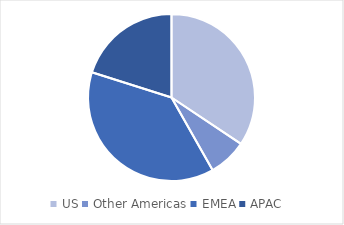
| Category | FY 2023 |
|---|---|
| US | 1720 |
| Other Americas | 372 |
| EMEA | 1906 |
| APAC | 1007 |